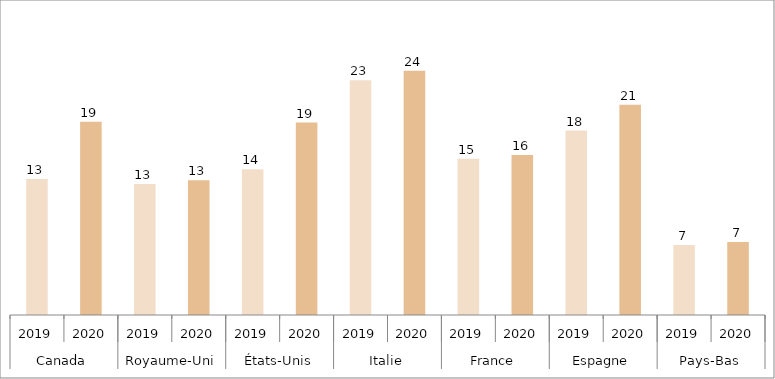
| Category | Ni études ni emploi |
|---|---|
| 0 | 13.387 |
| 1 | 19.017 |
| 2 | 12.873 |
| 3 | 13.244 |
| 4 | 14.341 |
| 5 | 18.931 |
| 6 | 23.084 |
| 7 | 24.028 |
| 8 | 15.361 |
| 9 | 15.739 |
| 10 | 18.146 |
| 11 | 20.688 |
| 12 | 6.882 |
| 13 | 7.19 |